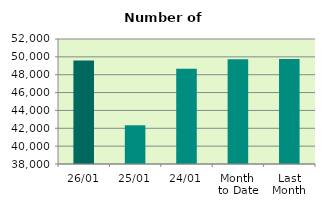
| Category | Series 0 |
|---|---|
| 26/01 | 49596 |
| 25/01 | 42336 |
| 24/01 | 48658 |
| Month 
to Date | 49739.111 |
| Last
Month | 49764 |